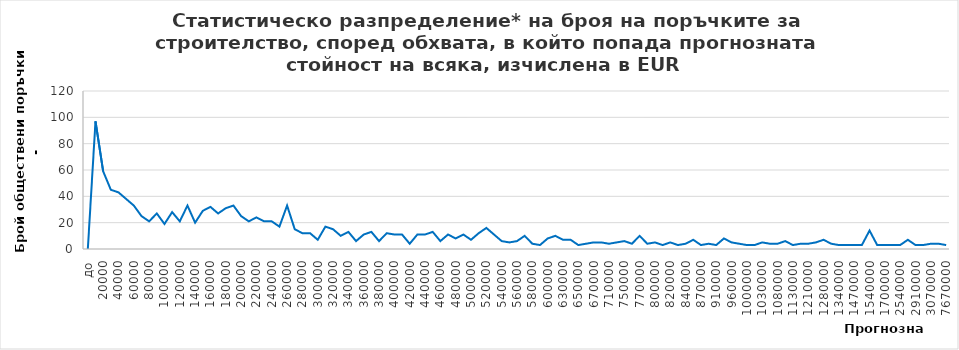
| Category | Series 0 |
|---|---|
| до | 0 |
| 10000 | 97 |
| 20000 | 59 |
| 30000 | 45 |
| 40000 | 43 |
| 50000 | 38 |
| 60000 | 33 |
| 70000 | 25 |
| 80000 | 21 |
| 90000 | 27 |
| 100000 | 19 |
| 110000 | 28 |
| 120000 | 21 |
| 130000 | 33 |
| 140000 | 20 |
| 150000 | 29 |
| 160000 | 32 |
| 170000 | 27 |
| 180000 | 31 |
| 190000 | 33 |
| 200000 | 25 |
| 210000 | 21 |
| 220000 | 24 |
| 230000 | 21 |
| 240000 | 21 |
| 250000 | 17 |
| 260000 | 33 |
| 270000 | 15 |
| 280000 | 12 |
| 290000 | 12 |
| 300000 | 7 |
| 310000 | 17 |
| 320000 | 15 |
| 330000 | 10 |
| 340000 | 13 |
| 350000 | 6 |
| 360000 | 11 |
| 370000 | 13 |
| 380000 | 6 |
| 390000 | 12 |
| 400000 | 11 |
| 410000 | 11 |
| 420000 | 4 |
| 430000 | 11 |
| 440000 | 11 |
| 450000 | 13 |
| 460000 | 6 |
| 470000 | 11 |
| 480000 | 8 |
| 490000 | 11 |
| 500000 | 7 |
| 510000 | 12 |
| 520000 | 16 |
| 530000 | 11 |
| 540000 | 6 |
| 550000 | 5 |
| 560000 | 6 |
| 570000 | 10 |
| 580000 | 4 |
| 590000 | 3 |
| 600000 | 8 |
| 620000 | 10 |
| 630000 | 7 |
| 640000 | 7 |
| 650000 | 3 |
| 660000 | 4 |
| 670000 | 5 |
| 690000 | 5 |
| 710000 | 4 |
| 720000 | 5 |
| 750000 | 6 |
| 760000 | 4 |
| 770000 | 10 |
| 790000 | 4 |
| 800000 | 5 |
| 810000 | 3 |
| 820000 | 5 |
| 830000 | 3 |
| 840000 | 4 |
| 860000 | 7 |
| 870000 | 3 |
| 890000 | 4 |
| 910000 | 3 |
| 940000 | 8 |
| 960000 | 5 |
| 970000 | 4 |
| 1000000 | 3 |
| 1010000 | 3 |
| 1030000 | 5 |
| 1070000 | 4 |
| 1080000 | 4 |
| 1090000 | 6 |
| 1130000 | 3 |
| 1140000 | 4 |
| 1210000 | 4 |
| 1270000 | 5 |
| 1280000 | 7 |
| 1310000 | 4 |
| 1340000 | 3 |
| 1390000 | 3 |
| 1470000 | 3 |
| 1490000 | 3 |
| 1540000 | 14 |
| 1630000 | 3 |
| 1700000 | 3 |
| 2050000 | 3 |
| 2540000 | 3 |
| 2560000 | 7 |
| 2910000 | 3 |
| 3020000 | 3 |
| 3070000 | 4 |
| 5120000 | 4 |
| 7670000 | 3 |